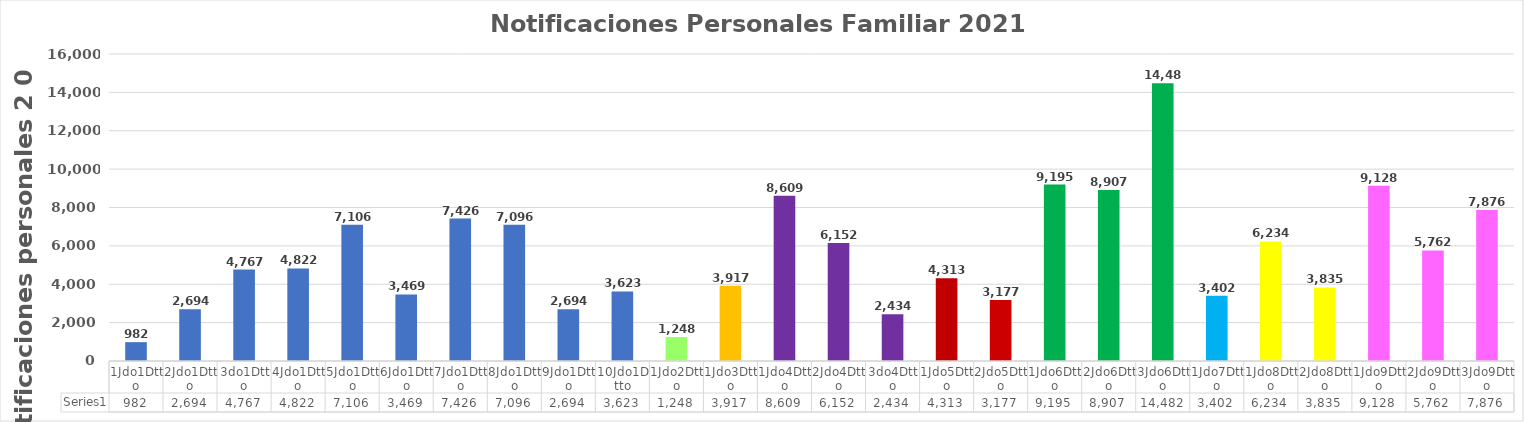
| Category | Series 0 |
|---|---|
| 1Jdo1Dtto | 982 |
| 2Jdo1Dtto | 2694 |
| 3do1Dtto | 4767 |
| 4Jdo1Dtto | 4822 |
| 5Jdo1Dtto | 7106 |
| 6Jdo1Dtto | 3469 |
| 7Jdo1Dtto | 7426 |
| 8Jdo1Dtto | 7096 |
| 9Jdo1Dtto | 2694 |
| 10Jdo1Dtto | 3623 |
| 1Jdo2Dtto | 1248 |
| 1Jdo3Dtto | 3917 |
| 1Jdo4Dtto | 8609 |
| 2Jdo4Dtto | 6152 |
| 3do4Dtto | 2434 |
| 1Jdo5Dtto | 4313 |
| 2Jdo5Dtto | 3177 |
| 1Jdo6Dtto | 9195 |
| 2Jdo6Dtto | 8907 |
| 3Jdo6Dtto | 14482 |
| 1Jdo7Dtto | 3402 |
| 1Jdo8Dtto | 6234 |
| 2Jdo8Dtto | 3835 |
| 1Jdo9Dtto | 9128 |
| 2Jdo9Dtto | 5762 |
| 3Jdo9Dtto | 7876 |